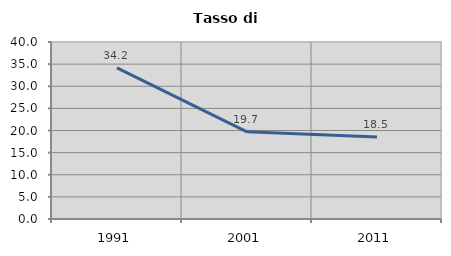
| Category | Tasso di disoccupazione   |
|---|---|
| 1991.0 | 34.171 |
| 2001.0 | 19.704 |
| 2011.0 | 18.52 |